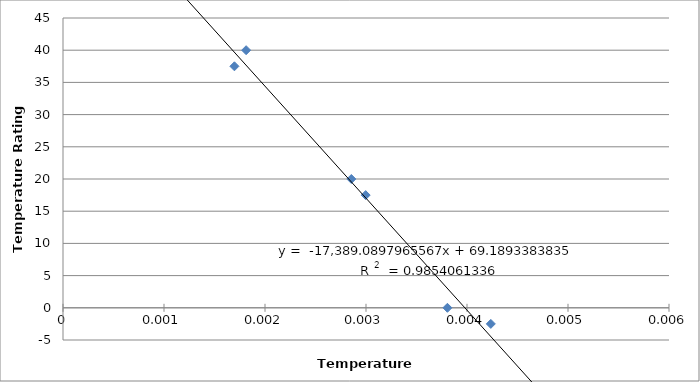
| Category | Series 0 |
|---|---|
| 0.0018132075754457926 | 40 |
| 0.001697270162156234 | 37.5 |
| 0.002854612509448186 | 20 |
| 0.00299670173356238 | 17.5 |
| 0.0038061500125975817 | 0 |
| 0.004235845889992465 | -2.5 |